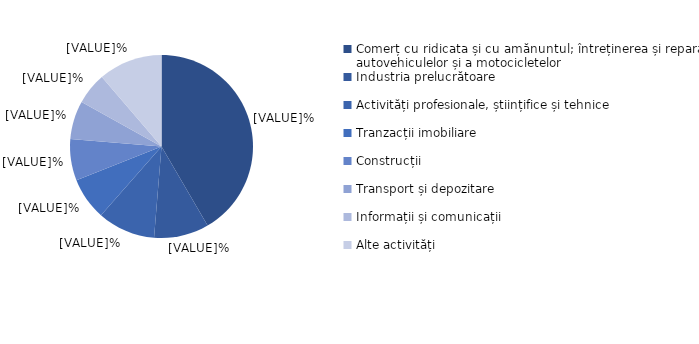
| Category | Series 0 |
|---|---|
| Comerț cu ridicata și cu amănuntul; întreținerea și repararea autovehiculelor și a motocicletelor | 41.6 |
| Industria prelucrătoare | 9.7 |
| Activități profesionale, științifice și tehnice | 10.2 |
| Tranzacții imobiliare | 7.5 |
| Construcții | 7.3 |
| Transport și depozitare | 6.8 |
| Informații și comunicații | 5.6 |
| Alte activități | 11.3 |